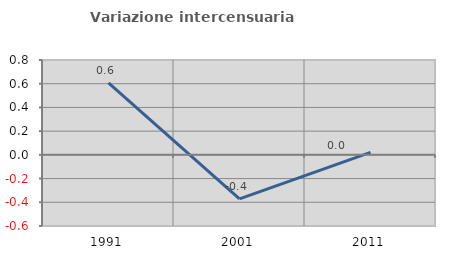
| Category | Variazione intercensuaria annua |
|---|---|
| 1991.0 | 0.607 |
| 2001.0 | -0.371 |
| 2011.0 | 0.021 |